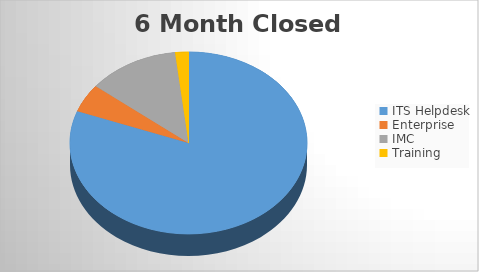
| Category | 6M Closed | 6M Opened |
|---|---|---|
| ITS Helpdesk | 1460 | 1496 |
| Enterprise | 91 | 95 |
| IMC | 226 | 225 |
| Training | 33 | 43 |